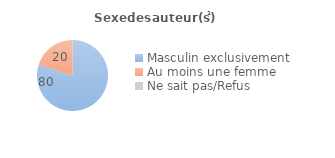
| Category | Series 0 |
|---|---|
| Masculin exclusivement | 80 |
| Au moins une femme | 20 |
| Ne sait pas/Refus | 0 |